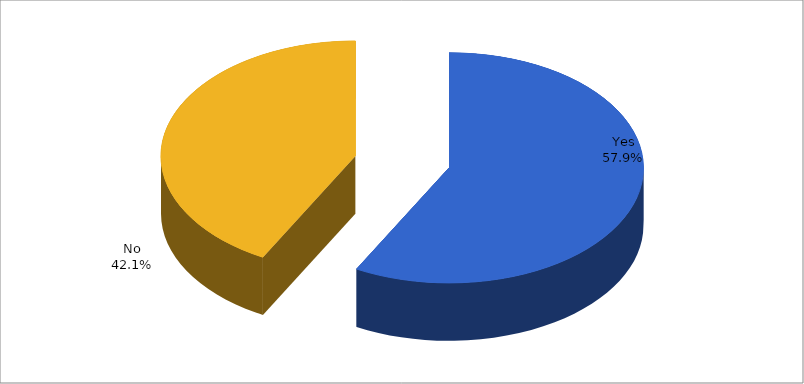
| Category | Series 0 |
|---|---|
| Yes | 0.579 |
| No | 0.421 |